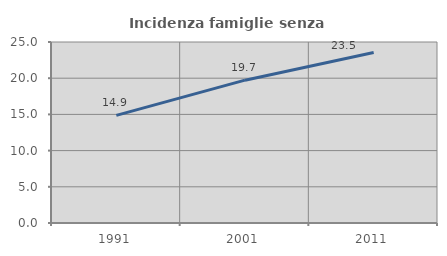
| Category | Incidenza famiglie senza nuclei |
|---|---|
| 1991.0 | 14.862 |
| 2001.0 | 19.728 |
| 2011.0 | 23.541 |